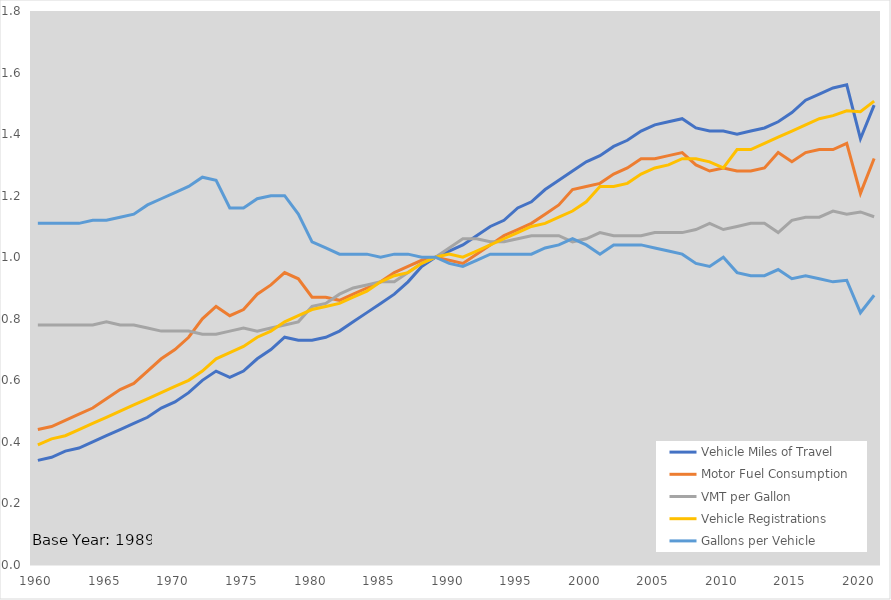
| Category | Vehicle Miles of Travel | Motor Fuel Consumption | VMT per Gallon | Vehicle Registrations | Gallons per Vehicle |
|---|---|---|---|---|---|
| 1960.0 | 0.34 | 0.44 | 0.78 | 0.39 | 1.11 |
| 1961.0 | 0.35 | 0.45 | 0.78 | 0.41 | 1.11 |
| 1962.0 | 0.37 | 0.47 | 0.78 | 0.42 | 1.11 |
| 1963.0 | 0.38 | 0.49 | 0.78 | 0.44 | 1.11 |
| 1964.0 | 0.4 | 0.51 | 0.78 | 0.46 | 1.12 |
| 1965.0 | 0.42 | 0.54 | 0.79 | 0.48 | 1.12 |
| 1966.0 | 0.44 | 0.57 | 0.78 | 0.5 | 1.13 |
| 1967.0 | 0.46 | 0.59 | 0.78 | 0.52 | 1.14 |
| 1968.0 | 0.48 | 0.63 | 0.77 | 0.54 | 1.17 |
| 1969.0 | 0.51 | 0.67 | 0.76 | 0.56 | 1.19 |
| 1970.0 | 0.53 | 0.7 | 0.76 | 0.58 | 1.21 |
| 1971.0 | 0.56 | 0.74 | 0.76 | 0.6 | 1.23 |
| 1972.0 | 0.6 | 0.8 | 0.75 | 0.63 | 1.26 |
| 1973.0 | 0.63 | 0.84 | 0.75 | 0.67 | 1.25 |
| 1974.0 | 0.61 | 0.81 | 0.76 | 0.69 | 1.16 |
| 1975.0 | 0.63 | 0.83 | 0.77 | 0.71 | 1.16 |
| 1976.0 | 0.67 | 0.88 | 0.76 | 0.74 | 1.19 |
| 1977.0 | 0.7 | 0.91 | 0.77 | 0.76 | 1.2 |
| 1978.0 | 0.74 | 0.95 | 0.78 | 0.79 | 1.2 |
| 1979.0 | 0.73 | 0.93 | 0.79 | 0.81 | 1.14 |
| 1980.0 | 0.73 | 0.87 | 0.84 | 0.83 | 1.05 |
| 1981.0 | 0.74 | 0.87 | 0.85 | 0.84 | 1.03 |
| 1982.0 | 0.76 | 0.86 | 0.88 | 0.85 | 1.01 |
| 1983.0 | 0.79 | 0.88 | 0.9 | 0.87 | 1.01 |
| 1984.0 | 0.82 | 0.9 | 0.91 | 0.89 | 1.01 |
| 1985.0 | 0.85 | 0.92 | 0.92 | 0.92 | 1 |
| 1986.0 | 0.88 | 0.95 | 0.92 | 0.94 | 1.01 |
| 1987.0 | 0.92 | 0.97 | 0.95 | 0.95 | 1.01 |
| 1988.0 | 0.97 | 0.99 | 0.98 | 0.98 | 1 |
| 1989.0 | 1 | 1 | 1 | 1 | 1 |
| 1990.0 | 1.02 | 0.99 | 1.03 | 1.01 | 0.98 |
| 1991.0 | 1.04 | 0.98 | 1.06 | 1 | 0.97 |
| 1992.0 | 1.07 | 1.01 | 1.06 | 1.02 | 0.99 |
| 1993.0 | 1.1 | 1.04 | 1.05 | 1.04 | 1.01 |
| 1994.0 | 1.12 | 1.07 | 1.05 | 1.06 | 1.01 |
| 1995.0 | 1.16 | 1.09 | 1.06 | 1.08 | 1.01 |
| 1996.0 | 1.18 | 1.11 | 1.07 | 1.1 | 1.01 |
| 1997.0 | 1.22 | 1.14 | 1.07 | 1.11 | 1.03 |
| 1998.0 | 1.25 | 1.17 | 1.07 | 1.13 | 1.04 |
| 1999.0 | 1.28 | 1.22 | 1.05 | 1.15 | 1.06 |
| 2000.0 | 1.31 | 1.23 | 1.06 | 1.18 | 1.04 |
| 2001.0 | 1.33 | 1.24 | 1.08 | 1.23 | 1.01 |
| 2002.0 | 1.36 | 1.27 | 1.07 | 1.23 | 1.04 |
| 2003.0 | 1.38 | 1.29 | 1.07 | 1.24 | 1.04 |
| 2004.0 | 1.41 | 1.32 | 1.07 | 1.27 | 1.04 |
| 2005.0 | 1.43 | 1.32 | 1.08 | 1.29 | 1.03 |
| 2006.0 | 1.44 | 1.33 | 1.08 | 1.3 | 1.02 |
| 2007.0 | 1.45 | 1.34 | 1.08 | 1.32 | 1.01 |
| 2008.0 | 1.42 | 1.3 | 1.09 | 1.32 | 0.98 |
| 2009.0 | 1.41 | 1.28 | 1.11 | 1.31 | 0.97 |
| 2010.0 | 1.41 | 1.29 | 1.09 | 1.29 | 1 |
| 2011.0 | 1.4 | 1.28 | 1.1 | 1.35 | 0.95 |
| 2012.0 | 1.41 | 1.28 | 1.11 | 1.35 | 0.94 |
| 2013.0 | 1.42 | 1.29 | 1.11 | 1.37 | 0.94 |
| 2014.0 | 1.44 | 1.34 | 1.08 | 1.39 | 0.96 |
| 2015.0 | 1.47 | 1.31 | 1.12 | 1.41 | 0.93 |
| 2016.0 | 1.51 | 1.34 | 1.13 | 1.43 | 0.94 |
| 2017.0 | 1.53 | 1.35 | 1.13 | 1.45 | 0.93 |
| 2018.0 | 1.55 | 1.35 | 1.15 | 1.46 | 0.92 |
| 2019.0 | 1.56 | 1.37 | 1.14 | 1.476 | 0.925 |
| 2020.0 | 1.385 | 1.207 | 1.147 | 1.473 | 0.82 |
| 2021.0 | 1.494 | 1.321 | 1.131 | 1.507 | 0.876 |